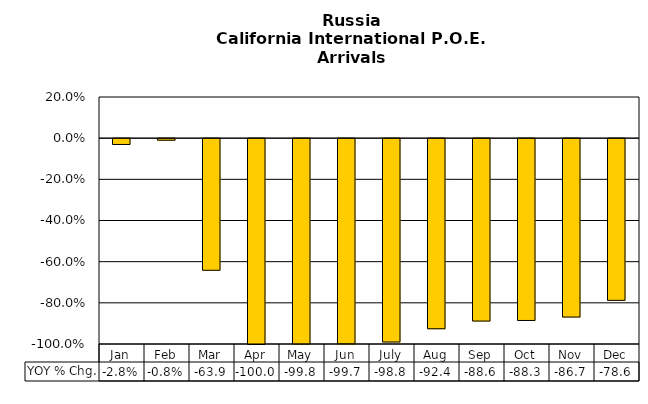
| Category | YOY % Chg. |
|---|---|
| Jan | -0.028 |
| Feb | -0.008 |
| Mar | -0.639 |
| Apr | -1 |
| May | -0.998 |
| Jun | -0.997 |
| July | -0.988 |
| Aug | -0.924 |
| Sep | -0.886 |
| Oct | -0.883 |
| Nov | -0.867 |
| Dec | -0.786 |